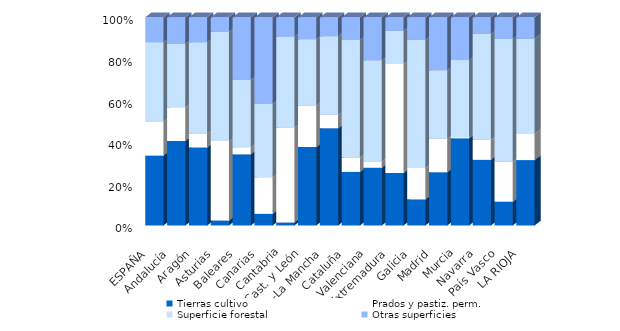
| Category | Tierras cultivo | Prados y pastiz. perm. | Superficie forestal | Otras superficies |
|---|---|---|---|---|
| ESPAÑA | 33.576 | 16.338 | 38.09 | 11.996 |
| Andalucía | 40.569 | 16.15 | 30.439 | 12.842 |
| Aragón | 37.466 | 6.746 | 43.731 | 12.058 |
| Asturias | 2.39 | 38.141 | 52.536 | 6.932 |
| Baleares | 34.177 | 3.389 | 32.42 | 30.014 |
| Canarias | 5.58 | 17.591 | 35.238 | 41.591 |
| Cantabria | 1.463 | 45.579 | 43.659 | 9.298 |
| Cast. y León | 37.673 | 19.8 | 32.002 | 10.525 |
| C.-La Mancha | 46.726 | 6.497 | 37.682 | 9.094 |
| Cataluña | 25.706 | 6.894 | 56.538 | 10.862 |
| C. Valenciana | 27.72 | 3.027 | 48.539 | 20.714 |
| Extremadura | 25.21 | 52.301 | 15.913 | 6.576 |
| Galicia | 12.549 | 15.052 | 61.574 | 10.825 |
| Madrid | 25.578 | 16.096 | 32.866 | 25.46 |
| Murcia | 41.876 | 0.569 | 36.97 | 20.585 |
| Navarra | 31.507 | 9.605 | 50.909 | 7.979 |
| País Vasco | 11.413 | 19.237 | 58.9 | 10.451 |
| LA RIOJA | 31.385 | 12.578 | 45.762 | 10.275 |